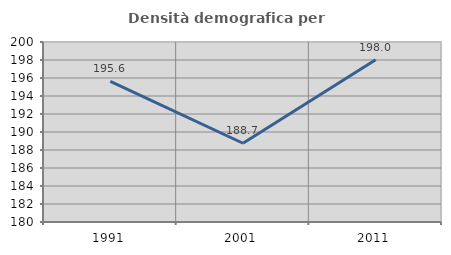
| Category | Densità demografica |
|---|---|
| 1991.0 | 195.628 |
| 2001.0 | 188.749 |
| 2011.0 | 198.024 |